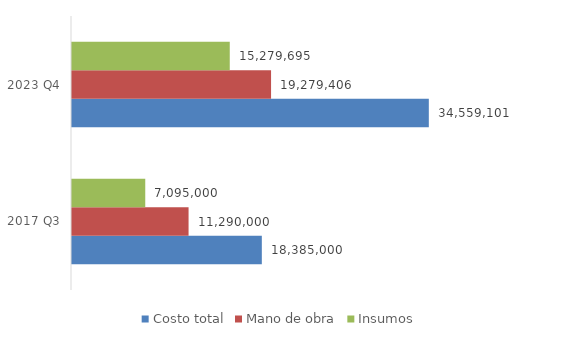
| Category | Costo total | Mano de obra | Insumos |
|---|---|---|---|
| 2017 Q3 | 18385000 | 11290000 | 7095000 |
| 2023 Q4 | 34559101.397 | 19279406 | 15279695.397 |